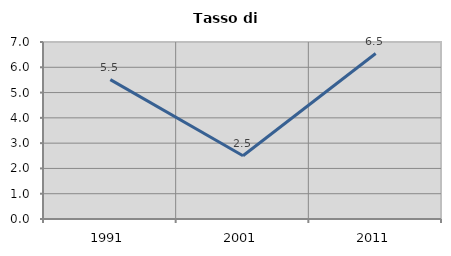
| Category | Tasso di disoccupazione   |
|---|---|
| 1991.0 | 5.514 |
| 2001.0 | 2.5 |
| 2011.0 | 6.544 |